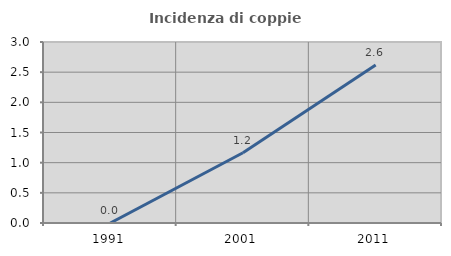
| Category | Incidenza di coppie miste |
|---|---|
| 1991.0 | 0 |
| 2001.0 | 1.165 |
| 2011.0 | 2.618 |